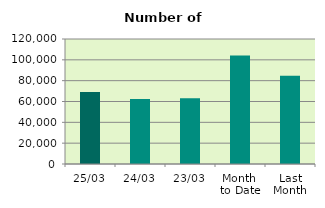
| Category | Series 0 |
|---|---|
| 25/03 | 69150 |
| 24/03 | 62290 |
| 23/03 | 63024 |
| Month 
to Date | 104215.474 |
| Last
Month | 84726.4 |